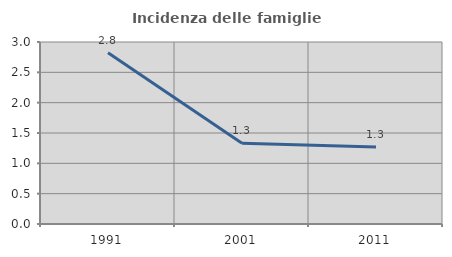
| Category | Incidenza delle famiglie numerose |
|---|---|
| 1991.0 | 2.823 |
| 2001.0 | 1.331 |
| 2011.0 | 1.268 |